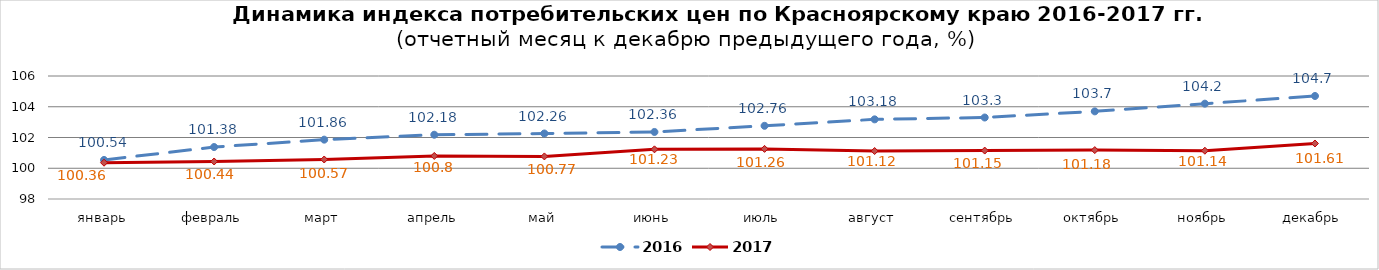
| Category | 2016 | 2017 |
|---|---|---|
| январь | 100.54 | 100.36 |
| февраль | 101.38 | 100.44 |
| март | 101.86 | 100.57 |
| апрель | 102.18 | 100.8 |
| май | 102.26 | 100.77 |
| июнь | 102.36 | 101.23 |
| июль | 102.76 | 101.26 |
| август | 103.18 | 101.12 |
| сентябрь | 103.3 | 101.15 |
| октябрь | 103.7 | 101.18 |
| ноябрь | 104.2 | 101.14 |
| декабрь | 104.7 | 101.61 |